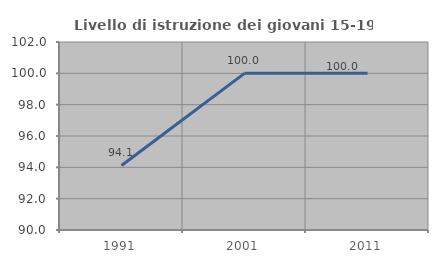
| Category | Livello di istruzione dei giovani 15-19 anni |
|---|---|
| 1991.0 | 94.118 |
| 2001.0 | 100 |
| 2011.0 | 100 |